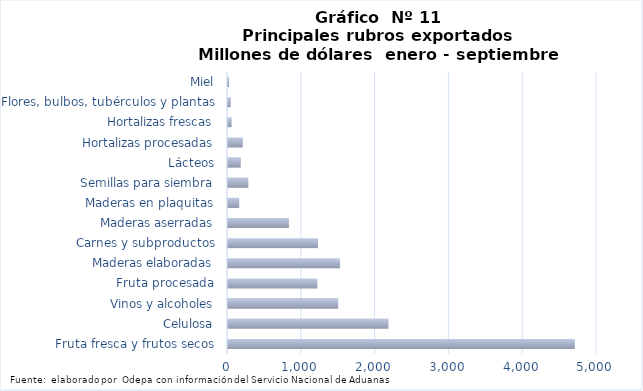
| Category | Series 7 |
|---|---|
| Fruta fresca y frutos secos | 4699903.163 |
| Celulosa | 2174915.5 |
| Vinos y alcoholes | 1493841.078 |
| Fruta procesada | 1210577.267 |
| Maderas elaboradas | 1516694.434 |
| Carnes y subproductos | 1218965.582 |
| Maderas aserradas | 825215.61 |
| Maderas en plaquitas | 152010.119 |
| Semillas para siembra | 275842.902 |
| Lácteos | 173786.814 |
| Hortalizas procesadas | 200484.619 |
| Hortalizas frescas | 49625.154 |
| Flores, bulbos, tubérculos y plantas | 37060.026 |
| Miel | 14928.736 |